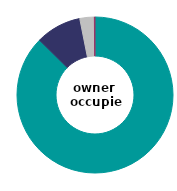
| Category | owner 
occupier |
|---|---|
| direct debit | 87.405 |
| standing order | 9.46 |
| pre-paid meter | 3.008 |
| other | 0.128 |